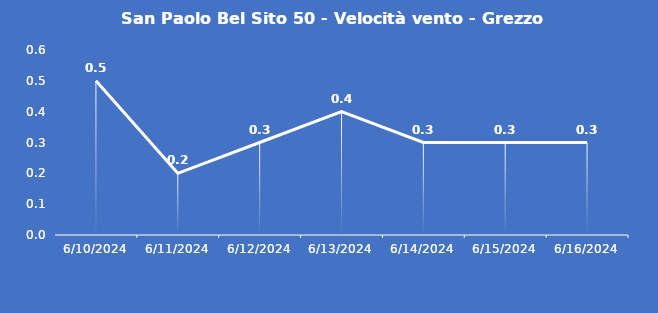
| Category | San Paolo Bel Sito 50 - Velocità vento - Grezzo (m/s) |
|---|---|
| 6/10/24 | 0.5 |
| 6/11/24 | 0.2 |
| 6/12/24 | 0.3 |
| 6/13/24 | 0.4 |
| 6/14/24 | 0.3 |
| 6/15/24 | 0.3 |
| 6/16/24 | 0.3 |